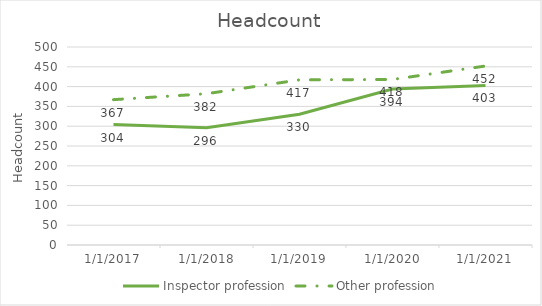
| Category | Inspector profession | Other profession |
|---|---|---|
| 3/31/17 | 304 | 367 |
| 3/31/18 | 296 | 382 |
| 3/31/19 | 330 | 417 |
| 3/31/20 | 394 | 418 |
| 3/31/21 | 403 | 452 |